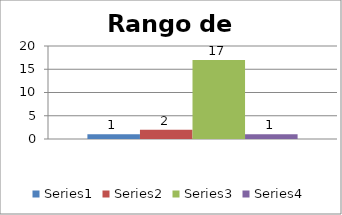
| Category | Series 0 | Series 1 | Series 2 | Series 3 |
|---|---|---|---|---|
| 0 | 1 | 2 | 17 | 1 |